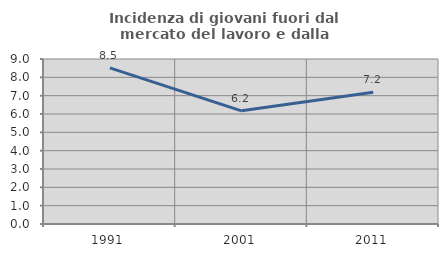
| Category | Incidenza di giovani fuori dal mercato del lavoro e dalla formazione  |
|---|---|
| 1991.0 | 8.518 |
| 2001.0 | 6.173 |
| 2011.0 | 7.182 |